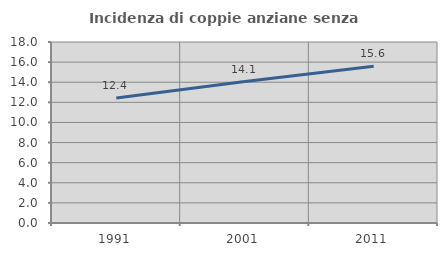
| Category | Incidenza di coppie anziane senza figli  |
|---|---|
| 1991.0 | 12.434 |
| 2001.0 | 14.071 |
| 2011.0 | 15.58 |